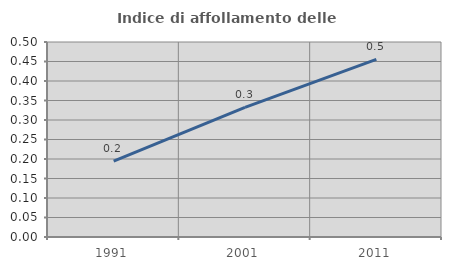
| Category | Indice di affollamento delle abitazioni  |
|---|---|
| 1991.0 | 0.194 |
| 2001.0 | 0.332 |
| 2011.0 | 0.456 |